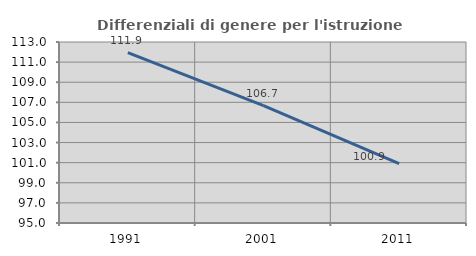
| Category | Differenziali di genere per l'istruzione superiore |
|---|---|
| 1991.0 | 111.945 |
| 2001.0 | 106.663 |
| 2011.0 | 100.912 |